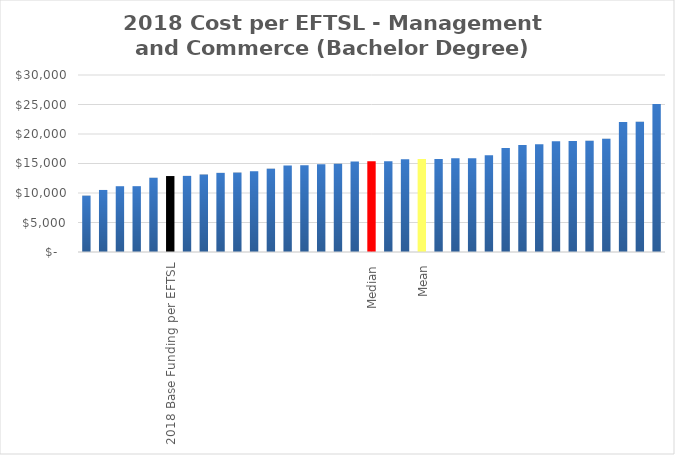
| Category | Series 0 |
|---|---|
|  | 9550.84 |
|  | 10516.459 |
|  | 11149.407 |
|  | 11157.166 |
|  | 12583.715 |
| 2018 Base Funding per EFTSL | 12874 |
|  | 12901.915 |
|  | 13131.46 |
|  | 13414.246 |
|  | 13462.44 |
|  | 13687.924 |
|  | 14120.332 |
|  | 14674.282 |
|  | 14720.92 |
|  | 14867.53 |
|  | 14952.532 |
|  | 15354.107 |
| Median | 15366.752 |
|  | 15379.397 |
|  | 15732.089 |
| Mean | 15755.292 |